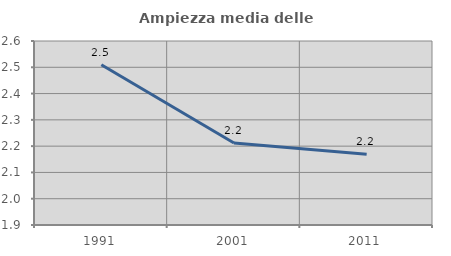
| Category | Ampiezza media delle famiglie |
|---|---|
| 1991.0 | 2.509 |
| 2001.0 | 2.212 |
| 2011.0 | 2.169 |